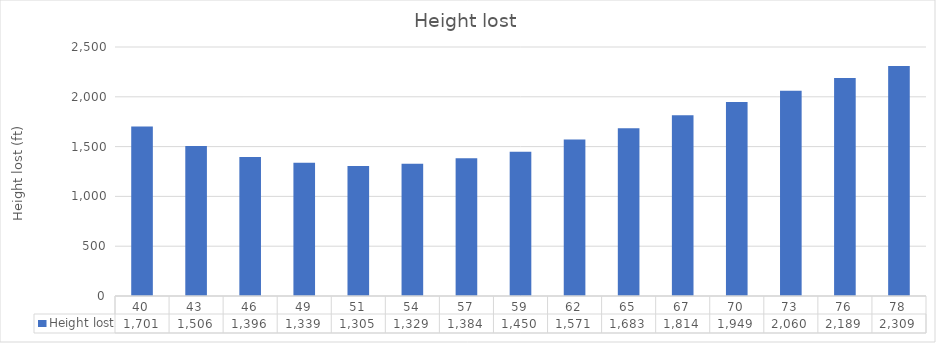
| Category | Height lost |
|---|---|
| 40.470886862826355 | 1700.787 |
| 43.16894598701478 | 1505.906 |
| 45.867005111203206 | 1396.48 |
| 48.56506423539163 | 1338.583 |
| 51.26312335958006 | 1305.429 |
| 53.961182483768475 | 1328.74 |
| 56.6592416079569 | 1383.577 |
| 59.357300732145326 | 1449.535 |
| 62.05535985633375 | 1571.38 |
| 64.75341898052217 | 1683.071 |
| 67.4514781047106 | 1814.173 |
| 70.14953722889902 | 1948.819 |
| 72.84759635308744 | 2060.368 |
| 75.54565547727587 | 2189.258 |
| 78.24371460146429 | 2309.259 |